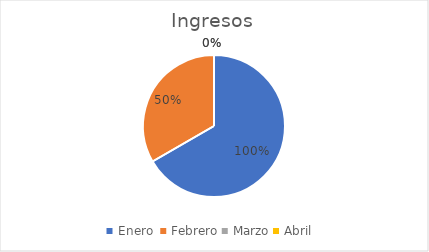
| Category | Series 0 |
|---|---|
| Enero  | 1 |
| Febrero | 0.5 |
| Marzo | 0 |
| Abril | 0 |